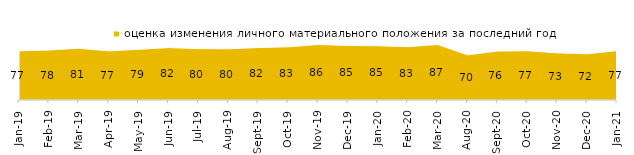
| Category | оценка изменения личного материального положения за последний год |
|---|---|
| 2019-01-01 | 76.7 |
| 2019-02-01 | 77.9 |
| 2019-03-01 | 80.656 |
| 2019-04-01 | 76.584 |
| 2019-05-01 | 79 |
| 2019-06-01 | 81.696 |
| 2019-07-01 | 80.05 |
| 2019-08-01 | 79.77 |
| 2019-09-01 | 81.733 |
| 2019-10-01 | 82.871 |
| 2019-11-01 | 86.436 |
| 2019-12-01 | 85 |
| 2020-01-01 | 84.505 |
| 2020-02-01 | 83.168 |
| 2020-03-01 | 86.564 |
| 2020-08-01 | 70.357 |
| 2020-09-01 | 76.307 |
| 2020-10-01 | 76.731 |
| 2020-11-01 | 73.45 |
| 2020-12-01 | 71.988 |
| 2021-01-01 | 77 |